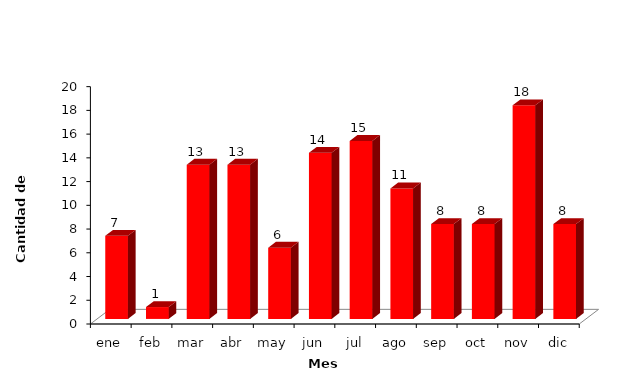
| Category | Series 0 |
|---|---|
| ene | 7 |
| feb | 1 |
| mar | 13 |
| abr | 13 |
| may | 6 |
| jun | 14 |
| jul | 15 |
| ago | 11 |
| sep | 8 |
| oct | 8 |
| nov | 18 |
| dic | 8 |